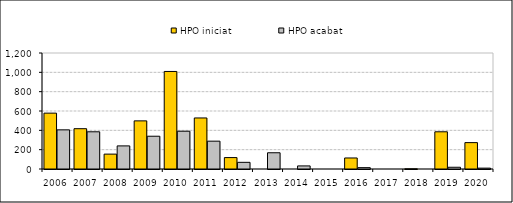
| Category | HPO iniciat | HPO acabat |
|---|---|---|
| 2006.0 | 578 | 405 |
| 2007.0 | 417 | 385 |
| 2008.0 | 154 | 239 |
| 2009.0 | 498 | 339 |
| 2010.0 | 1009 | 391 |
| 2011.0 | 528 | 288 |
| 2012.0 | 118 | 69 |
| 2013.0 | 0 | 168 |
| 2014.0 | 0 | 32 |
| 2015.0 | 0 | 0 |
| 2016.0 | 114 | 14 |
| 2017.0 | 0 | 0 |
| 2018.0 | 2 | 0 |
| 2019.0 | 385 | 18 |
| 2020.0 | 273 | 9 |